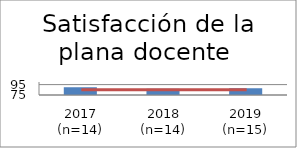
| Category | Faculty Satisfaction |
|---|---|
| 2017 (n=14) | 90 |
| 2018 (n=14) | 87 |
| 2019 (n=15) | 88 |